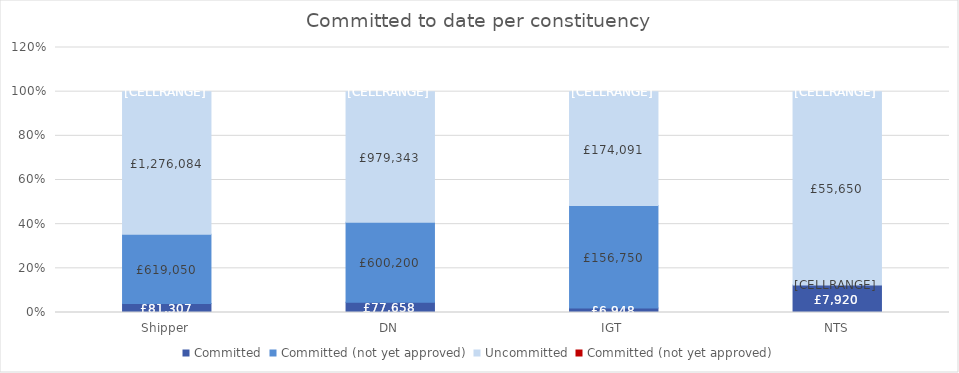
| Category | Committed | Committed (not yet approved) | Uncommitted |
|---|---|---|---|
| Shipper | 0.041 | 0 | 0.646 |
| DN | 0.047 | 0 | 0.591 |
| IGT | 0.021 | 0 | 0.515 |
| NTS | 0.125 | 0 | 0.875 |